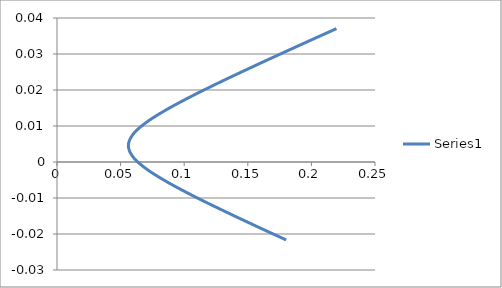
| Category | Series 0 |
|---|---|
| 0.18013347877841177 | -0.022 |
| 0.1600198295127096 | -0.018 |
| 0.14026018020294698 | -0.015 |
| 0.1210280426871065 | -0.012 |
| 0.10262043040059507 | -0.009 |
| 0.08557111082226916 | -0.005 |
| 0.07086729804312533 | -0.002 |
| 0.06025138595361628 | 0.001 |
| 0.05609440025129511 | 0.004 |
| 0.059759774285013466 | 0.008 |
| 0.07002982335020849 | 0.011 |
| 0.08453057640374546 | 0.014 |
| 0.10146406846100685 | 0.017 |
| 0.11980314137364141 | 0.021 |
| 0.13899253515979887 | 0.024 |
| 0.15872414318598646 | 0.027 |
| 0.1788185647043548 | 0.031 |
| 0.1991660141403345 | 0.034 |
| 0.2196961992092551 | 0.037 |